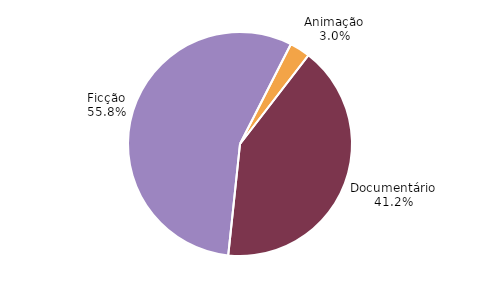
| Category | Series 0 |
|---|---|
| Animação | 0.03 |
| Documentário | 0.412 |
| Ficção | 0.558 |